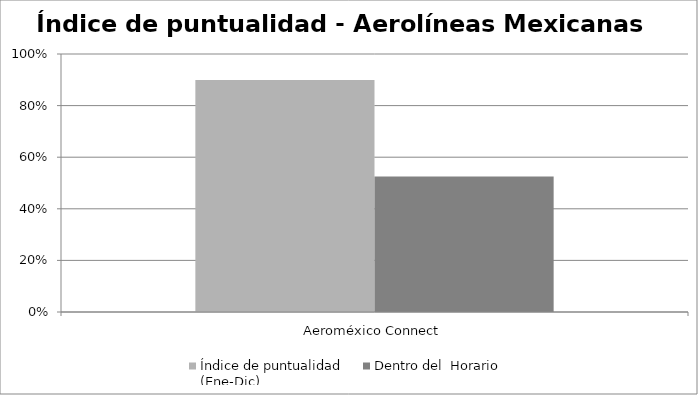
| Category | Índice de puntualidad
(Ene-Dic) | Dentro del  Horario |
|---|---|---|
| Aeroméxico Connect | 0.899 | 0.526 |